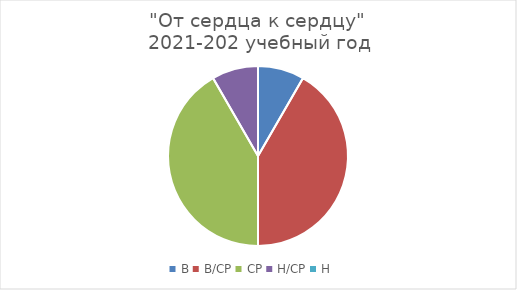
| Category | декабрь | май |
|---|---|---|
| В | 1 | 3 |
| В/СР | 5 | 8 |
| СР | 5 | 3 |
| Н/СР | 1 | 0 |
| Н | 0 | 0 |